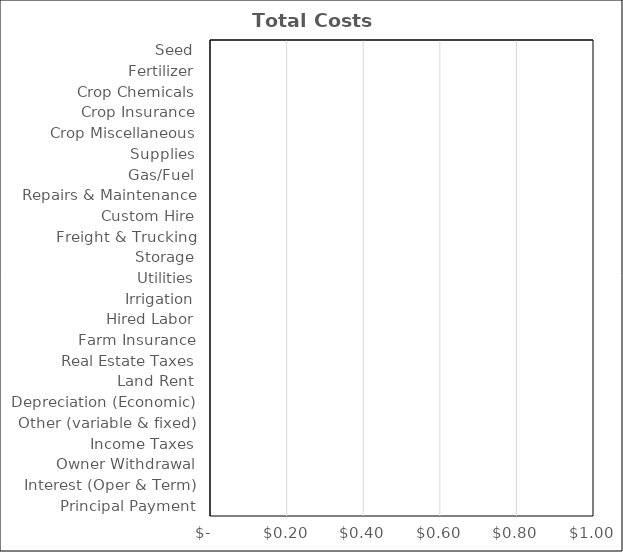
| Category | Grass |
|---|---|
| Seed | 0 |
| Fertilizer | 0 |
| Crop Chemicals | 0 |
| Crop Insurance | 0 |
| Crop Miscellaneous | 0 |
| Supplies | 0 |
| Gas/Fuel | 0 |
| Repairs & Maintenance | 0 |
| Custom Hire | 0 |
| Freight & Trucking | 0 |
| Storage | 0 |
| Utilities | 0 |
| Irrigation | 0 |
| Hired Labor | 0 |
| Farm Insurance | 0 |
| Real Estate Taxes | 0 |
| Land Rent | 0 |
| Depreciation (Economic) | 0 |
| Other (variable & fixed) | 0 |
| Income Taxes | 0 |
| Owner Withdrawal | 0 |
| Interest (Oper & Term) | 0 |
| Principal Payment | 0 |